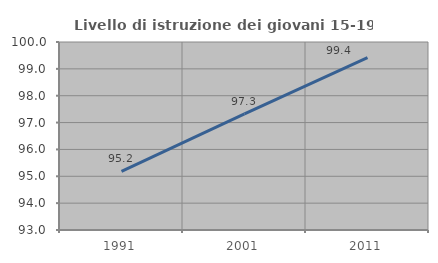
| Category | Livello di istruzione dei giovani 15-19 anni |
|---|---|
| 1991.0 | 95.181 |
| 2001.0 | 97.327 |
| 2011.0 | 99.42 |